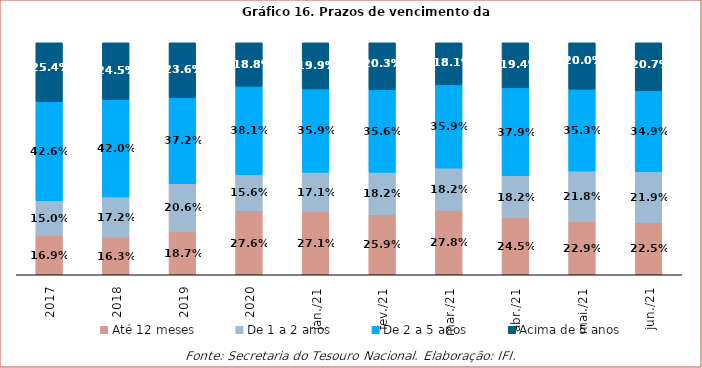
| Category | Até 12 meses | De 1 a 2 anos | De 2 a 5 anos | Acima de 5 anos |
|---|---|---|---|---|
| 2017.0 | 0.169 | 0.15 | 0.426 | 0.254 |
| 2018.0 | 0.163 | 0.172 | 0.42 | 0.245 |
| 2019.0 | 0.187 | 0.206 | 0.372 | 0.236 |
| 2020.0 | 0.276 | 0.156 | 0.381 | 0.188 |
| 44197.0 | 0.271 | 0.171 | 0.359 | 0.199 |
| 44228.0 | 0.259 | 0.182 | 0.356 | 0.203 |
| 44256.0 | 0.278 | 0.182 | 0.359 | 0.181 |
| 44287.0 | 0.245 | 0.182 | 0.379 | 0.194 |
| 44317.0 | 0.229 | 0.218 | 0.353 | 0.2 |
| 44348.0 | 0.225 | 0.219 | 0.349 | 0.207 |